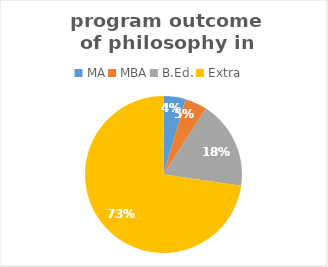
| Category | Series 0 |
|---|---|
| MA | 1 |
| MBA | 1 |
| B.Ed. | 4 |
| Extra | 16 |